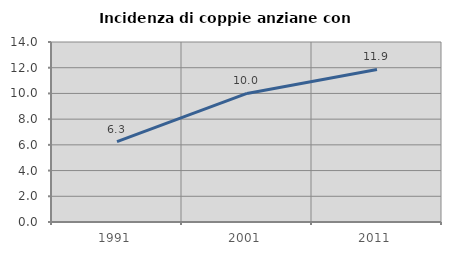
| Category | Incidenza di coppie anziane con figli |
|---|---|
| 1991.0 | 6.25 |
| 2001.0 | 10 |
| 2011.0 | 11.864 |